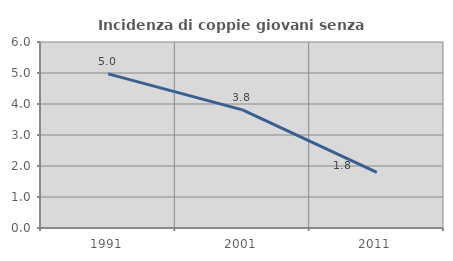
| Category | Incidenza di coppie giovani senza figli |
|---|---|
| 1991.0 | 4.972 |
| 2001.0 | 3.811 |
| 2011.0 | 1.793 |